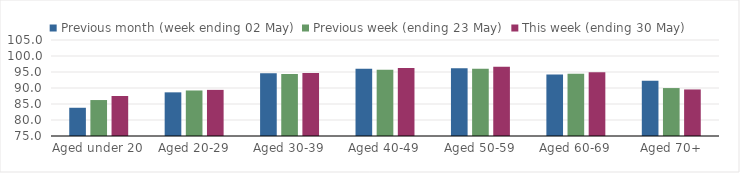
| Category | Previous month (week ending 02 May) | Previous week (ending 23 May) | This week (ending 30 May) |
|---|---|---|---|
| Aged under 20 | 83.824 | 86.238 | 87.496 |
| Aged 20-29 | 88.643 | 89.227 | 89.413 |
| Aged 30-39 | 94.591 | 94.36 | 94.717 |
| Aged 40-49 | 96.002 | 95.736 | 96.26 |
| Aged 50-59 | 96.153 | 96.017 | 96.639 |
| Aged 60-69 | 94.235 | 94.433 | 94.934 |
| Aged 70+ | 92.272 | 89.98 | 89.542 |